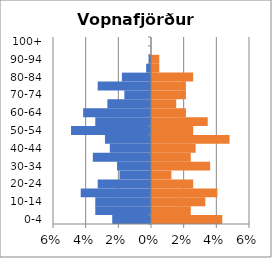
| Category | % Men | % Women |
|---|---|---|
| 0-4 | -0.024 | 0.043 |
| 5-9 | -0.034 | 0.024 |
| 10-14 | -0.034 | 0.033 |
| 15-19 | -0.043 | 0.04 |
| 20-24 | -0.033 | 0.025 |
| 25-29 | -0.019 | 0.012 |
| 30-34 | -0.021 | 0.036 |
| 35-39 | -0.036 | 0.024 |
| 40-44 | -0.025 | 0.027 |
| 45-49 | -0.028 | 0.047 |
| 50-54 | -0.049 | 0.025 |
| 55-59 | -0.034 | 0.034 |
| 60-64 | -0.042 | 0.021 |
| 65-69 | -0.027 | 0.015 |
| 70-74 | -0.016 | 0.021 |
| 75-79 | -0.033 | 0.021 |
| 80-84 | -0.018 | 0.025 |
| 85-89 | -0.003 | 0.004 |
| 90-94 | -0.001 | 0.004 |
| 95-99 | 0 | 0 |
| 100+ | 0 | 0 |